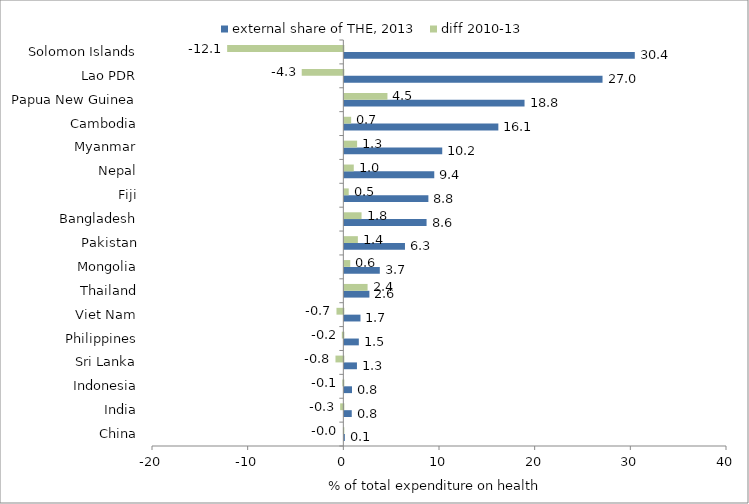
| Category | external share of THE, 2013 | diff 2010-13 |
|---|---|---|
| China | 0.053 | -0.042 |
| India | 0.775 | -0.332 |
| Indonesia | 0.8 | -0.1 |
| Sri Lanka | 1.319 | -0.821 |
| Philippines | 1.515 | -0.157 |
| Viet Nam | 1.687 | -0.716 |
| Thailand | 2.619 | 2.43 |
| Mongolia | 3.707 | 0.619 |
| Pakistan | 6.339 | 1.415 |
| Bangladesh | 8.596 | 1.8 |
| Fiji | 8.785 | 0.46 |
| Nepal | 9.401 | 0.987 |
| Myanmar | 10.234 | 1.335 |
| Cambodia | 16.099 | 0.712 |
| Papua New Guinea | 18.837 | 4.506 |
| Lao PDR | 26.989 | -4.349 |
| Solomon Islands | 30.362 | -12.144 |